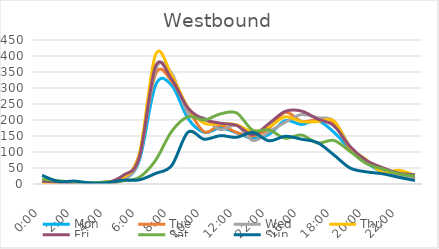
| Category | Mon | Tue | Wed | Thu | Fri | Sat | Sun |
|---|---|---|---|---|---|---|---|
| 0.0 | 6 | 3 | 5 | 4 | 9 | 15 | 27 |
| 0.041667 | 2 | 2 | 5 | 2 | 6 | 10 | 8 |
| 0.083333 | 3 | 1 | 3 | 2 | 4 | 6 | 9 |
| 0.125 | 3 | 0 | 2 | 2 | 2 | 4 | 3 |
| 0.166667 | 4 | 3 | 7 | 7 | 4 | 6 | 4 |
| 0.208333 | 13 | 15 | 14 | 20 | 27 | 10 | 12 |
| 0.25 | 74 | 93 | 80 | 93 | 84 | 21 | 13 |
| 0.291667 | 309 | 344 | 359 | 404 | 368 | 74 | 33 |
| 0.333333 | 308 | 321 | 345 | 339 | 327 | 165 | 58 |
| 0.375 | 205 | 236 | 221 | 239 | 237 | 210 | 162 |
| 0.416667 | 161 | 163 | 206 | 190 | 202 | 200 | 140 |
| 0.458333 | 175 | 183 | 170 | 188 | 190 | 219 | 151 |
| 0.5 | 160 | 161 | 184 | 185 | 183 | 222 | 146 |
| 0.541667 | 143 | 150 | 136 | 163 | 154 | 168 | 161 |
| 1900-01-02 22:00:00 | 155 | 174 | 163 | 178 | 189 | 169 | 135 |
| 0.625 | 198 | 224 | 193 | 210 | 227 | 143 | 149 |
| 0.666667 | 186 | 196 | 217 | 195 | 228 | 153 | 140 |
| 0.708333 | 198 | 200 | 207 | 195 | 203 | 128 | 129 |
| 0.75 | 162 | 188 | 197 | 197 | 182 | 136 | 91 |
| 0.791667 | 109 | 111 | 117 | 114 | 117 | 102 | 50 |
| 0.833333 | 68 | 67 | 69 | 76 | 74 | 64 | 38 |
| 0.875 | 36 | 50 | 45 | 36 | 51 | 47 | 32 |
| 0.916667 | 28 | 29 | 28 | 43 | 34 | 32 | 21 |
| 0.958333 | 24 | 16 | 14 | 27 | 29 | 25 | 11 |